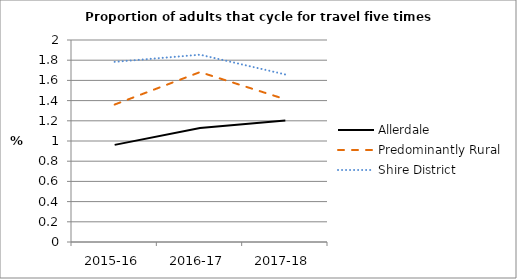
| Category | Allerdale | Predominantly Rural | Shire District |
|---|---|---|---|
| 2015-16 | 0.962 | 1.361 | 1.783 |
| 2016-17 | 1.128 | 1.682 | 1.854 |
| 2017-18 | 1.204 | 1.413 | 1.659 |